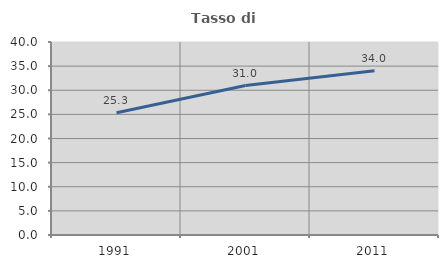
| Category | Tasso di occupazione   |
|---|---|
| 1991.0 | 25.319 |
| 2001.0 | 30.969 |
| 2011.0 | 34.028 |